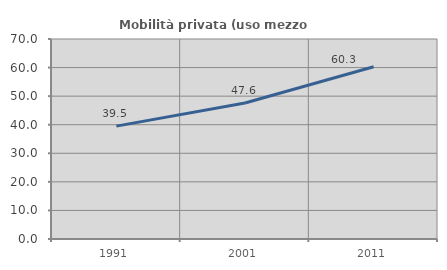
| Category | Mobilità privata (uso mezzo privato) |
|---|---|
| 1991.0 | 39.506 |
| 2001.0 | 47.619 |
| 2011.0 | 60.279 |